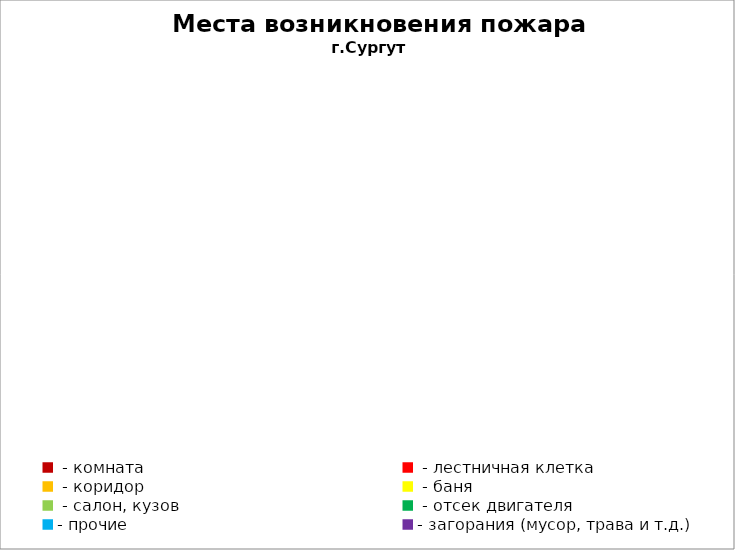
| Category | Места возникновения пожара |
|---|---|
|  - комната | 61 |
|  - лестничная клетка | 27 |
|  - коридор | 12 |
|  - баня | 28 |
|  - салон, кузов | 14 |
|  - отсек двигателя | 50 |
| - прочие | 172 |
| - загорания (мусор, трава и т.д.)  | 181 |